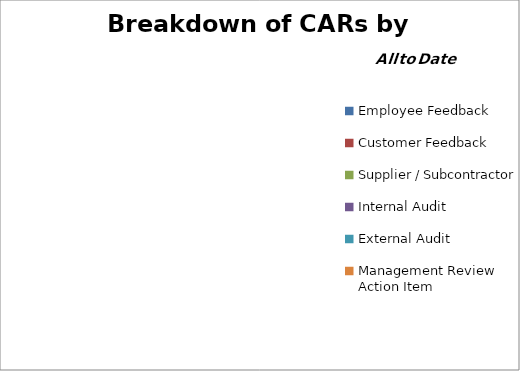
| Category | Series 0 |
|---|---|
| Employee Feedback | 0 |
| Customer Feedback | 0 |
| Supplier / Subcontractor | 0 |
| Internal Audit | 0 |
| External Audit | 0 |
| Management Review Action Item | 0 |